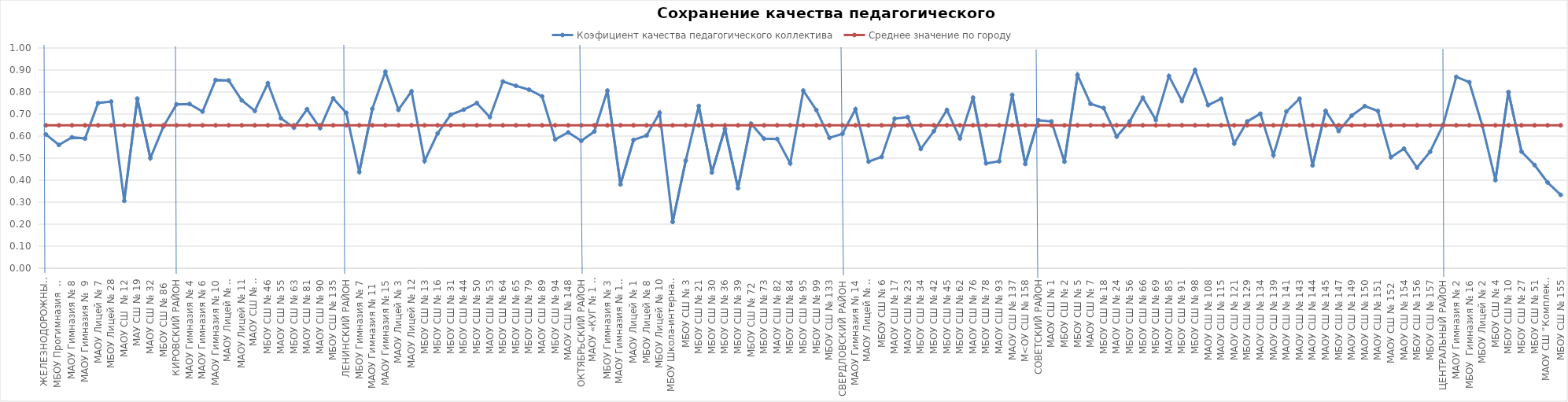
| Category | Коэфициент качества педагогического коллектива | Среднее значение по городу |
|---|---|---|
| ЖЕЛЕЗНОДОРОЖНЫЙ РАЙОН | 0.608 | 0.649 |
| МБОУ Прогимназия  № 131 | 0.56 | 0.649 |
| МАОУ Гимназия № 8 | 0.595 | 0.649 |
| МАОУ Гимназия №  9 | 0.589 | 0.649 |
| МАОУ Лицей № 7 | 0.75 | 0.649 |
| МБОУ Лицей № 28 | 0.757 | 0.649 |
| МАОУ СШ  № 12 | 0.306 | 0.649 |
| МАУ СШ № 19 | 0.77 | 0.649 |
| МАОУ СШ № 32 | 0.5 | 0.649 |
| МБОУ СШ № 86  | 0.643 | 0.649 |
| КИРОВСКИЙ РАЙОН | 0.744 | 0.649 |
| МАОУ Гимназия № 4 | 0.746 | 0.649 |
| МАОУ Гимназия № 6 | 0.712 | 0.649 |
| МАОУ Гимназия № 10 | 0.855 | 0.649 |
| МАОУ Лицей № 6 "Перспектива" | 0.852 | 0.649 |
| МАОУ Лицей № 11 | 0.762 | 0.649 |
| МАОУ СШ № 8 "Созидание" | 0.714 | 0.649 |
| МБОУ СШ № 46 | 0.84 | 0.649 |
| МАОУ СШ № 55 | 0.681 | 0.649 |
| МБОУ СШ № 63 | 0.638 | 0.649 |
| МАОУ СШ № 81 | 0.722 | 0.649 |
| МАОУ СШ № 90 | 0.636 | 0.649 |
| МБОУ СШ № 135 | 0.771 | 0.649 |
| ЛЕНИНСКИЙ РАЙОН | 0.706 | 0.649 |
| МБОУ Гимназия № 7 | 0.437 | 0.649 |
| МАОУ Гимназия № 11  | 0.724 | 0.649 |
| МАОУ Гимназия № 15 | 0.892 | 0.649 |
| МАОУ Лицей № 3 | 0.719 | 0.649 |
| МАОУ Лицей № 12 | 0.803 | 0.649 |
| МБОУ СШ № 13 | 0.487 | 0.649 |
| МБОУ СШ № 16 | 0.612 | 0.649 |
| МБОУ СШ № 31 | 0.697 | 0.649 |
| МБОУ СШ № 44 | 0.72 | 0.649 |
| МБОУ СШ № 50 | 0.75 | 0.649 |
| МАОУ СШ № 53 | 0.686 | 0.649 |
| МБОУ СШ № 64 | 0.848 | 0.649 |
| МБОУ СШ № 65 | 0.828 | 0.649 |
| МБОУ СШ № 79 | 0.811 | 0.649 |
| МАОУ СШ № 89 | 0.78 | 0.649 |
| МБОУ СШ № 94 | 0.585 | 0.649 |
| МАОУ СШ № 148 | 0.617 | 0.649 |
| ОКТЯБРЬСКИЙ РАЙОН | 0.578 | 0.649 |
| МАОУ «КУГ № 1 – Универс» | 0.621 | 0.649 |
| МБОУ Гимназия № 3 | 0.806 | 0.649 |
| МАОУ Гимназия № 13 "Академ" | 0.381 | 0.649 |
| МАОУ Лицей № 1 | 0.583 | 0.649 |
| МБОУ Лицей № 8 | 0.603 | 0.649 |
| МБОУ Лицей № 10 | 0.706 | 0.649 |
| МБОУ Школа-интернат № 1 | 0.211 | 0.649 |
| МБОУ СШ № 3 | 0.489 | 0.649 |
| МБОУ СШ № 21 | 0.737 | 0.649 |
| МБОУ СШ № 30 | 0.435 | 0.649 |
| МБОУ СШ № 36 | 0.633 | 0.649 |
| МБОУ СШ № 39 | 0.364 | 0.649 |
| МБОУ СШ № 72  | 0.656 | 0.649 |
| МБОУ СШ № 73 | 0.588 | 0.649 |
| МАОУ СШ № 82 | 0.587 | 0.649 |
| МБОУ СШ № 84 | 0.476 | 0.649 |
| МБОУ СШ № 95 | 0.806 | 0.649 |
| МБОУ СШ № 99 | 0.718 | 0.649 |
| МБОУ СШ № 133 | 0.592 | 0.649 |
| СВЕРДЛОВСКИЙ РАЙОН | 0.61 | 0.649 |
| МАОУ Гимназия № 14 | 0.722 | 0.649 |
| МАОУ Лицей № 9 "Лидер" | 0.484 | 0.649 |
| МБОУ СШ № 6 | 0.506 | 0.649 |
| МАОУ СШ № 17 | 0.679 | 0.649 |
| МАОУ СШ № 23 | 0.686 | 0.649 |
| МБОУ СШ № 34 | 0.542 | 0.649 |
| МБОУ СШ № 42 | 0.622 | 0.649 |
| МБОУ СШ № 45 | 0.719 | 0.649 |
| МБОУ СШ № 62 | 0.59 | 0.649 |
| МАОУ СШ № 76 | 0.775 | 0.649 |
| МБОУ СШ № 78 | 0.476 | 0.649 |
| МАОУ СШ № 93 | 0.486 | 0.649 |
| МАОУ СШ № 137 | 0.787 | 0.649 |
| М<ОУ СШ № 158 | 0.474 | 0.649 |
| СОВЕТСКИЙ РАЙОН | 0.672 | 0.649 |
| МАОУ СШ № 1 | 0.667 | 0.649 |
| МБОУ СШ № 2 | 0.484 | 0.649 |
| МБОУ СШ № 5 | 0.878 | 0.649 |
| МАОУ СШ № 7 | 0.746 | 0.649 |
| МБОУ СШ № 18 | 0.727 | 0.649 |
| МАОУ СШ № 24 | 0.598 | 0.649 |
| МБОУ СШ № 56 | 0.667 | 0.649 |
| МБОУ СШ № 66 | 0.774 | 0.649 |
| МБОУ СШ № 69 | 0.673 | 0.649 |
| МАОУ СШ № 85 | 0.873 | 0.649 |
| МБОУ СШ № 91 | 0.759 | 0.649 |
| МБОУ СШ № 98 | 0.9 | 0.649 |
| МАОУ СШ № 108 | 0.741 | 0.649 |
| МАОУ СШ № 115 | 0.769 | 0.649 |
| МАОУ СШ № 121 | 0.566 | 0.649 |
| МБОУ СШ № 129 | 0.667 | 0.649 |
| МАОУ СШ № 134 | 0.701 | 0.649 |
| МАОУ СШ № 139 | 0.513 | 0.649 |
| МАОУ СШ № 141 | 0.712 | 0.649 |
| МАОУ СШ № 143 | 0.77 | 0.649 |
| МАОУ СШ № 144 | 0.467 | 0.649 |
| МАОУ СШ № 145 | 0.714 | 0.649 |
| МБОУ СШ № 147 | 0.623 | 0.649 |
| МАОУ СШ № 149 | 0.693 | 0.649 |
| МАОУ СШ № 150 | 0.736 | 0.649 |
| МАОУ СШ № 151 | 0.714 | 0.649 |
| МАОУ СШ № 152  | 0.504 | 0.649 |
| МАОУ СШ № 154 | 0.543 | 0.649 |
| МБОУ СШ № 156 | 0.457 | 0.649 |
| МБОУ СШ № 157 | 0.529 | 0.649 |
| ЦЕНТРАЛЬНЫЙ РАЙОН | 0.651 | 0.649 |
| МАОУ Гимназия № 2 | 0.869 | 0.649 |
| МБОУ  Гимназия № 16 | 0.845 | 0.649 |
| МБОУ Лицей № 2 | 0.647 | 0.649 |
| МБОУ СШ № 4 | 0.4 | 0.649 |
| МБОУ СШ № 10 | 0.8 | 0.649 |
| МБОУ СШ № 27 | 0.529 | 0.649 |
| МБОУ СШ № 51 | 0.469 | 0.649 |
| МАОУ СШ "Комплекс "Покровский" | 0.389 | 0.649 |
| МБОУ СШ № 155 | 0.333 | 0.649 |